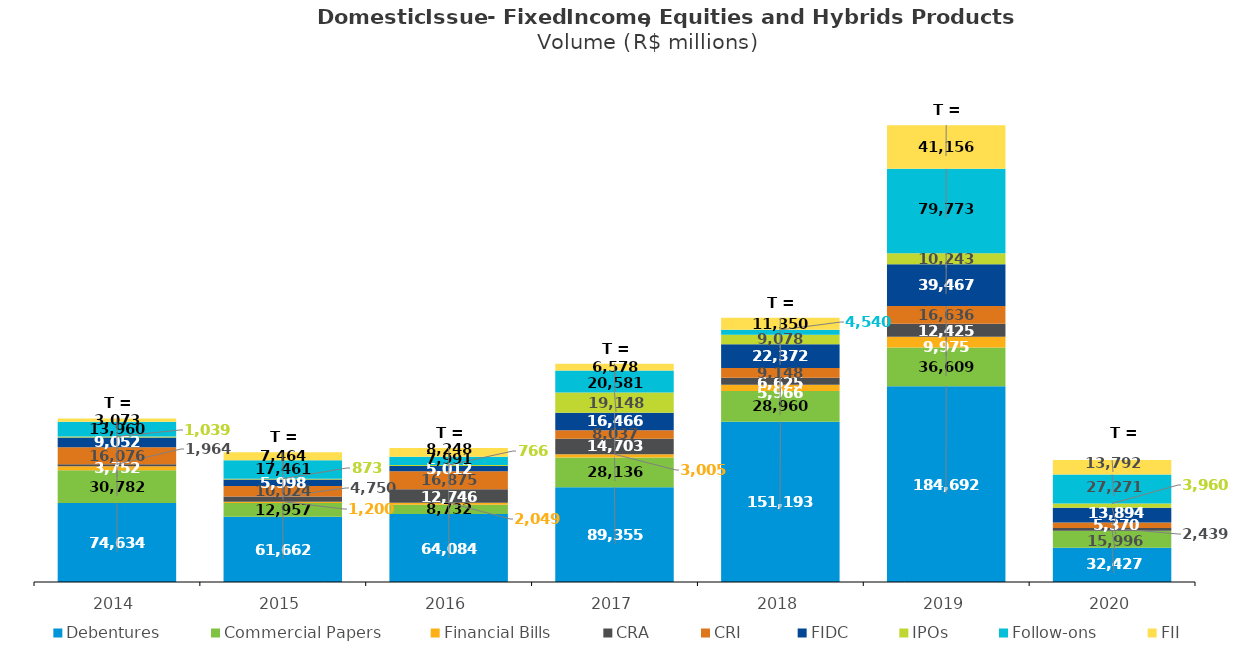
| Category | Debentures | Commercial Papers | Financial Bills | CRA | CRI  | FIDC | IPOs | Follow-ons | FII |
|---|---|---|---|---|---|---|---|---|---|
| 2014.0 | 74633.922 | 30781.855 | 3752.05 | 1963.912 | 16075.813 | 9052.095 | 1038.981 | 13959.9 | 3073.427 |
| 2015.0 | 61661.546 | 12956.838 | 1200.1 | 4749.688 | 10024.134 | 5997.944 | 872.8 | 17461.217 | 7464.042 |
| 2016.0 | 64084.335 | 8732.153 | 2048.5 | 12746.48 | 16874.782 | 5012.31 | 766.366 | 7991.486 | 8248.482 |
| 2017.0 | 89354.549 | 28135.92 | 3005 | 14702.844 | 8036.947 | 16465.788 | 19147.643 | 20581.166 | 6577.656 |
| 2018.0 | 151192.625 | 28959.774 | 5966.25 | 6624.623 | 9147.757 | 22371.603 | 9078.187 | 4540.4 | 11350.311 |
| 2019.0 | 184691.62 | 36608.955 | 9974.662 | 12425.159 | 16636.402 | 39467.029 | 10243.013 | 79773.431 | 41156.149 |
| 2020.0 | 32426.598 | 15996 | 0 | 2438.953 | 5370.263 | 13893.94 | 3960.11 | 27270.933 | 13791.92 |